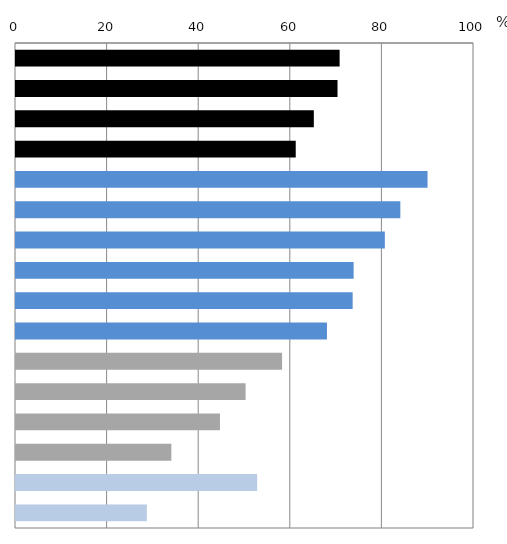
| Category | OECD average-31 |
|---|---|
| Tell students to follow classroom rules | 70.658 |
| Tell students to listen to what I say | 70.201 |
| Calm students who are disruptive | 65.027 |
| When the lesson begins, tell students to quieten down quickly | 61.076 |
| Explain what I expect students to learn | 89.856 |
| Explain how new and old topics are related | 83.918 |
| Set goals at the beginning of instruction | 80.536 |
| Refer to a problem from everyday life or work to demonstrate why new knowledge is useful | 73.719 |
| Present a summary of recently learned content | 73.504 |
| Let students practise similar tasks until I know that every student has understood the subject matter | 67.894 |
| Give tasks that require students to think critically | 58.092 |
| Have students work in small groups to come up with a joint solution to a problem or task | 50.13 |
| Ask students to decide on their own procedures for solving complex tasks | 44.531 |
| Present tasks for which there is no obvious solution | 33.922 |
| Let students use ICT for projects or class work | 52.651 |
| Give students projects that require at least one week to complete | 28.573 |